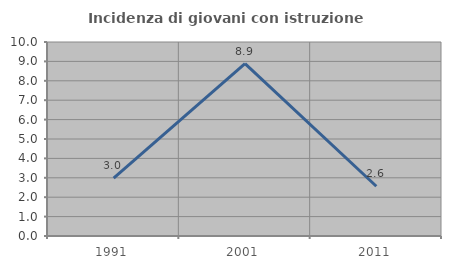
| Category | Incidenza di giovani con istruzione universitaria |
|---|---|
| 1991.0 | 2.985 |
| 2001.0 | 8.889 |
| 2011.0 | 2.564 |